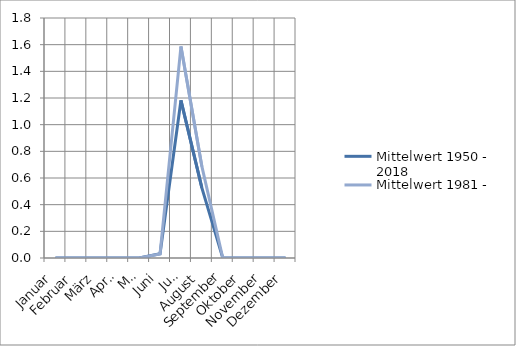
| Category | Mittelwert 1950 - 2018 | Mittelwert 1981 - 2010 |
|---|---|---|
| Januar | 0 | 0 |
| Februar | 0 | 0 |
| März | 0 | 0 |
| April | 0 | 0 |
| Mai | 0 | 0 |
| Juni | 0.032 | 0.03 |
| Juli | 1.183 | 1.587 |
| August | 0.526 | 0.687 |
| September | 0 | 0 |
| Oktober | 0 | 0 |
| November | 0 | 0 |
| Dezember | 0 | 0 |